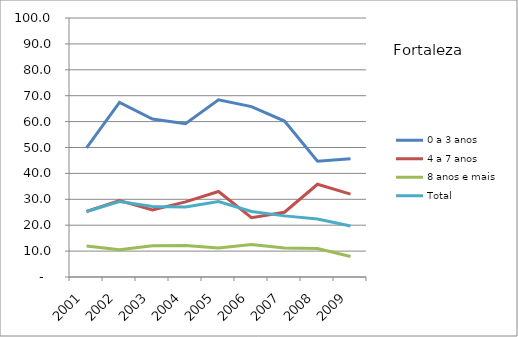
| Category | 0 a 3 anos | 4 a 7 anos | 8 anos e mais | Total |
|---|---|---|---|---|
| 2001.0 | 49.9 | 25.3 | 12 | 25.3 |
| 2002.0 | 67.4 | 29.5 | 10.5 | 29.1 |
| 2003.0 | 61 | 25.9 | 12.1 | 27.2 |
| 2004.0 | 59.2 | 29 | 12.2 | 27 |
| 2005.0 | 68.4 | 33 | 11.2 | 29.1 |
| 2006.0 | 65.8 | 22.9 | 12.5 | 25.3 |
| 2007.0 | 60.2 | 25 | 11.2 | 23.6 |
| 2008.0 | 44.7 | 35.8 | 11 | 22.4 |
| 2009.0 | 45.7 | 32 | 7.9 | 19.7 |